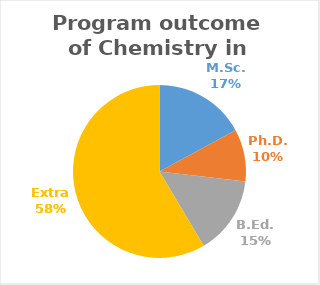
| Category | Series 0 |
|---|---|
| M.Sc. | 7 |
| Ph.D. | 4 |
| B.Ed. | 6 |
| Extra | 24 |